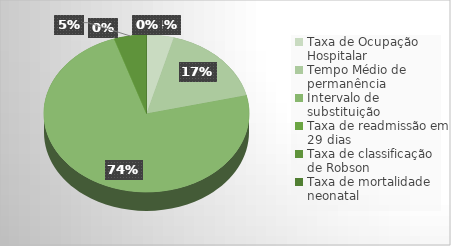
| Category | Series 0 |
|---|---|
| Taxa de Ocupação Hospitalar | 0.847 |
| Tempo Médio de permanência | 3.36 |
| Intervalo de substituição | 14.56 |
| Taxa de readmissão em 29 dias | 0.015 |
| Taxa de classificação de Robson | 1 |
| Taxa de mortalidade neonatal | 0 |